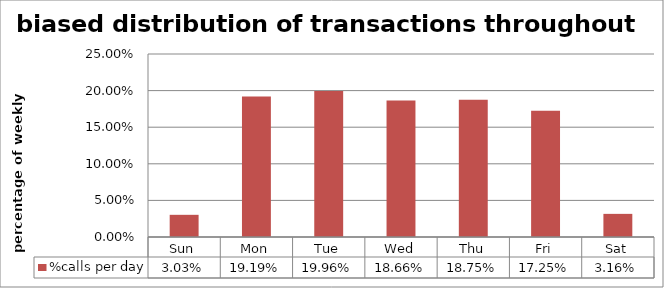
| Category | %calls per day |
|---|---|
| Sun | 0.03 |
| Mon | 0.192 |
| Tue | 0.2 |
| Wed | 0.187 |
| Thu | 0.188 |
| Fri | 0.172 |
| Sat | 0.032 |